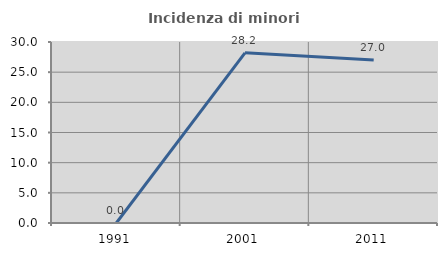
| Category | Incidenza di minori stranieri |
|---|---|
| 1991.0 | 0 |
| 2001.0 | 28.205 |
| 2011.0 | 27.01 |